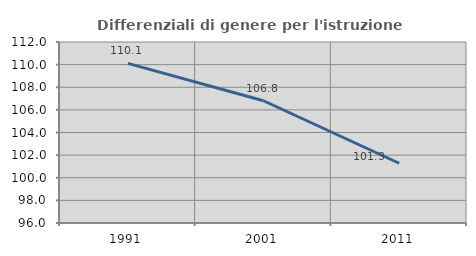
| Category | Differenziali di genere per l'istruzione superiore |
|---|---|
| 1991.0 | 110.115 |
| 2001.0 | 106.807 |
| 2011.0 | 101.282 |